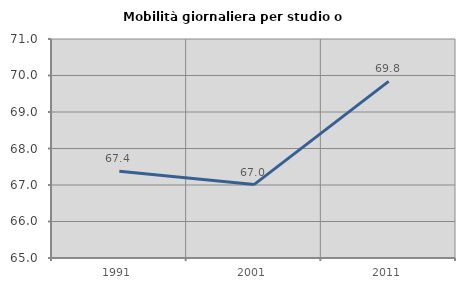
| Category | Mobilità giornaliera per studio o lavoro |
|---|---|
| 1991.0 | 67.379 |
| 2001.0 | 67.011 |
| 2011.0 | 69.839 |